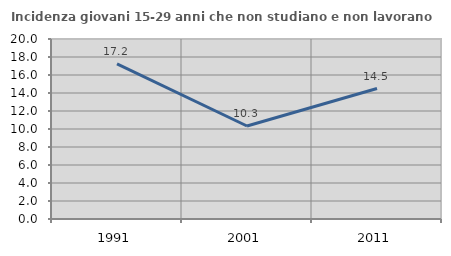
| Category | Incidenza giovani 15-29 anni che non studiano e non lavorano  |
|---|---|
| 1991.0 | 17.225 |
| 2001.0 | 10.334 |
| 2011.0 | 14.498 |